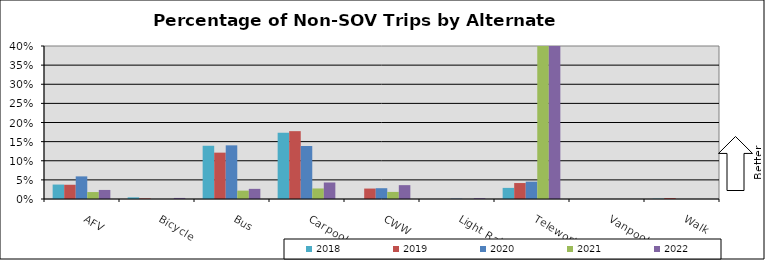
| Category | 2018 | 2019 | 2020 | 2021 | 2022 |
|---|---|---|---|---|---|
| AFV | 0.038 | 0.037 | 0.059 | 0.018 | 0.024 |
| Bicycle | 0.004 | 0.002 | 0 | 0 | 0.003 |
| Bus | 0.139 | 0.121 | 0.14 | 0.022 | 0.027 |
| Carpool | 0.173 | 0.177 | 0.139 | 0.028 | 0.043 |
| CWW | 0 | 0.027 | 0.028 | 0.019 | 0.036 |
| Light Rail | 0 | 0 | 0.001 | 0 | 0.002 |
| Telework | 0.029 | 0.042 | 0.045 | 0.722 | 0.463 |
| Vanpool | 0 | 0 | 0 | 0 | 0 |
| Walk | 0.001 | 0.002 | 0 | 0 | 0 |